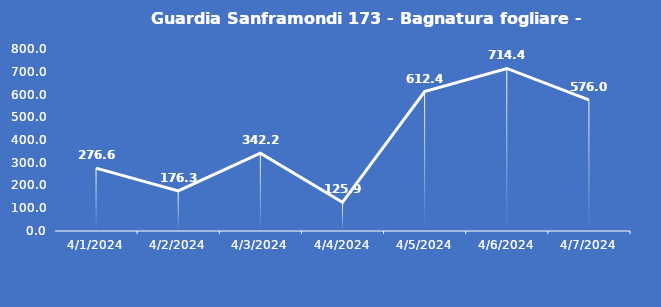
| Category | Guardia Sanframondi 173 - Bagnatura fogliare - Grezzo (min) |
|---|---|
| 4/1/24 | 276.6 |
| 4/2/24 | 176.3 |
| 4/3/24 | 342.2 |
| 4/4/24 | 125.9 |
| 4/5/24 | 612.4 |
| 4/6/24 | 714.4 |
| 4/7/24 | 576 |